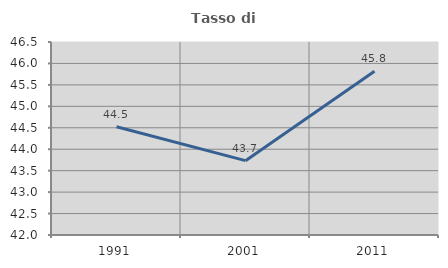
| Category | Tasso di occupazione   |
|---|---|
| 1991.0 | 44.523 |
| 2001.0 | 43.733 |
| 2011.0 | 45.82 |